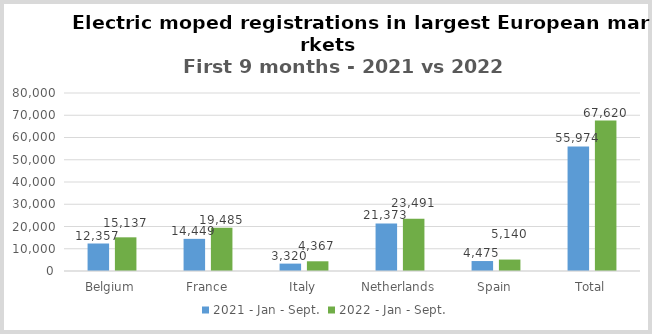
| Category | 2021 - Jan - Sept. | 2022 - Jan - Sept. |
|---|---|---|
| Belgium | 12357 | 15137 |
| France | 14449 | 19485 |
| Italy | 3320 | 4367 |
| Netherlands | 21373 | 23491 |
| Spain | 4475 | 5140 |
| Total | 55974 | 67620 |